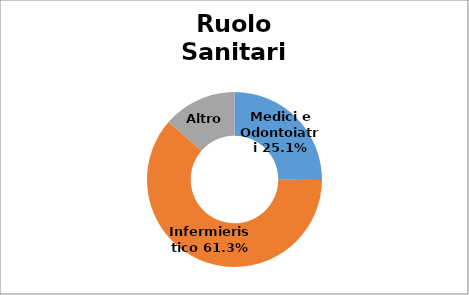
| Category | Series 0 |
|---|---|
| Medici e Odontoiatri | 0.251 |
| Infermieristico | 0.613 |
| Altro  | 0.136 |